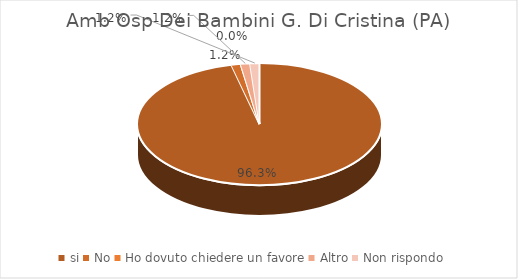
| Category | Amb Osp Dei Bambini G. Di Cristina (PA) |
|---|---|
| si | 0.963 |
| No | 0.012 |
| Ho dovuto chiedere un favore | 0 |
| Altro | 0.012 |
| Non rispondo | 0.012 |